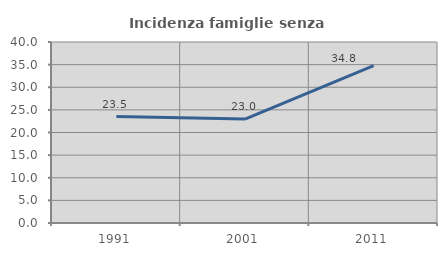
| Category | Incidenza famiglie senza nuclei |
|---|---|
| 1991.0 | 23.509 |
| 2001.0 | 22.961 |
| 2011.0 | 34.763 |